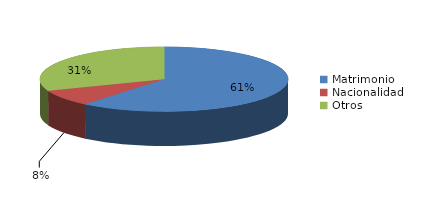
| Category | Series 0 |
|---|---|
| Matrimonio | 547 |
| Nacionalidad | 73 |
| Otros | 278 |